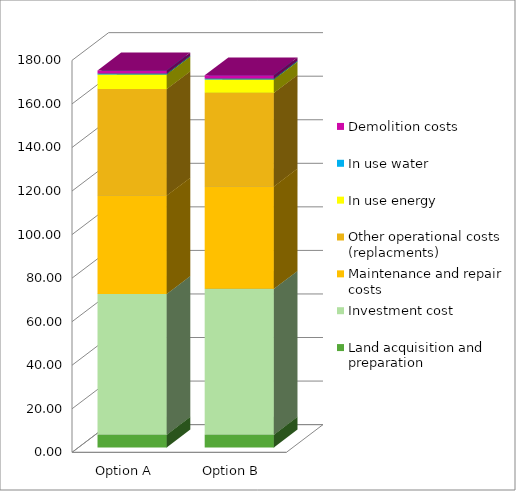
| Category | Land acquisition and preparation | Investment cost | Maintenance and repair costs | Other operational costs (replacments) | In use energy | In use water | Demolition costs |
|---|---|---|---|---|---|---|---|
| Option A | 5.838 | 64.646 | 45.178 | 48.898 | 6.704 | 0.47 | 1.362 |
| Option B | 5.84 | 67 | 47 | 43 | 6.1 | 0.47 | 1.45 |